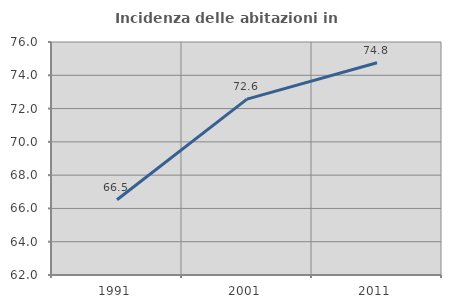
| Category | Incidenza delle abitazioni in proprietà  |
|---|---|
| 1991.0 | 66.521 |
| 2001.0 | 72.569 |
| 2011.0 | 74.754 |